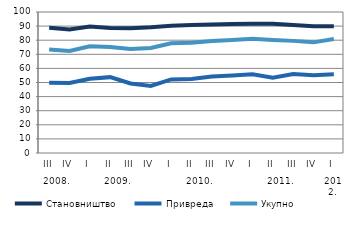
| Category | Становништво | Привреда | Укупно |
|---|---|---|---|
| 0 | 88.817 | 49.82 | 73.393 |
| 1 | 87.55 | 49.686 | 72.409 |
| 2 | 89.78 | 52.623 | 75.754 |
| 3 | 88.657 | 53.802 | 75.179 |
| 4 | 88.506 | 49.302 | 73.737 |
| 5 | 89.145 | 47.52 | 74.446 |
| 6 | 90.255 | 52.187 | 77.794 |
| 7 | 90.71 | 52.436 | 78.202 |
| 8 | 91.125 | 54.264 | 79.475 |
| 9 | 91.477 | 55.032 | 80.178 |
| 10 | 91.705 | 55.835 | 81.001 |
| 11 | 91.716 | 53.389 | 80.106 |
| 12 | 90.798 | 56.006 | 79.523 |
| 13 | 89.871 | 55.108 | 78.467 |
| 14 | 89.871 | 55.86 | 80.783 |